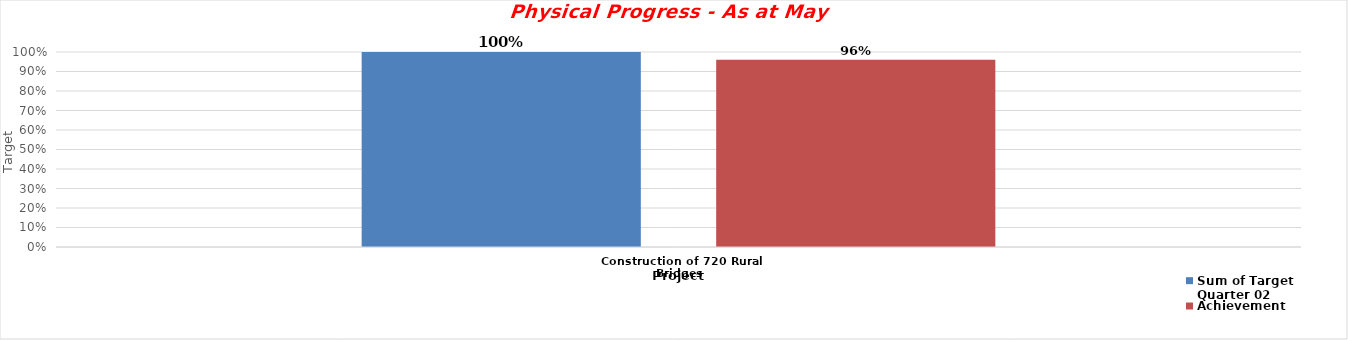
| Category | Sum of Target Quarter 02 | Achievement |
|---|---|---|
| Construction of 720 Rural Bridges | 1 | 0.96 |